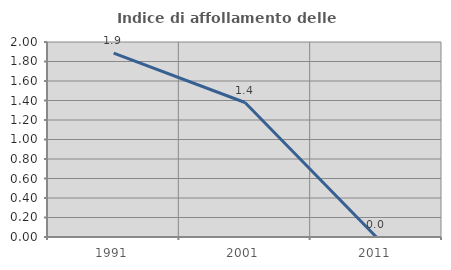
| Category | Indice di affollamento delle abitazioni  |
|---|---|
| 1991.0 | 1.887 |
| 2001.0 | 1.379 |
| 2011.0 | 0 |